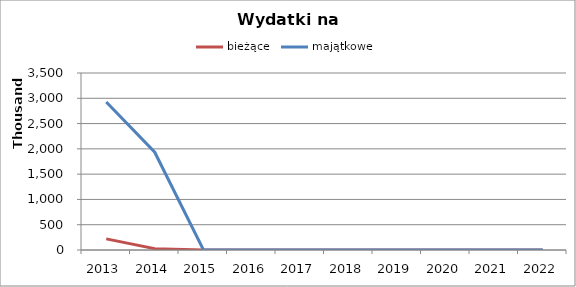
| Category | bieżące | majątkowe |
|---|---|---|
| 2013.0 | 220152 | 2925561 |
| 2014.0 | 26738 | 1933304 |
| 2015.0 | 0 | 10456 |
| 2016.0 | 0 | 0 |
| 2017.0 | 0 | 0 |
| 2018.0 | 0 | 0 |
| 2019.0 | 0 | 0 |
| 2020.0 | 0 | 0 |
| 2021.0 | 0 | 0 |
| 2022.0 | 0 | 0 |